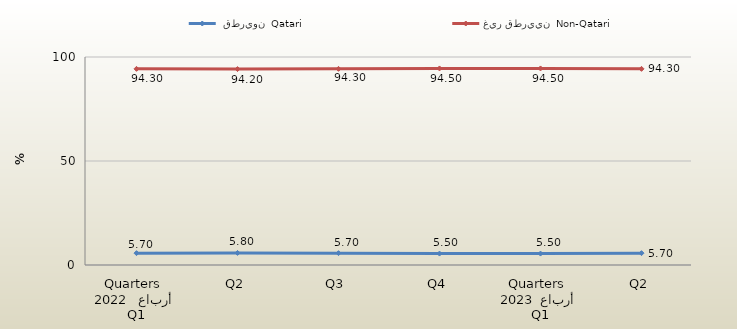
| Category |  قطريون  Qatari | غير قطريين  Non-Qatari |
|---|---|---|
| 0 | 5.7 | 94.3 |
| 1 | 5.8 | 94.2 |
| 2 | 5.7 | 94.3 |
| 3 | 5.5 | 94.5 |
| 4 | 5.5 | 94.5 |
| 5 | 5.7 | 94.3 |